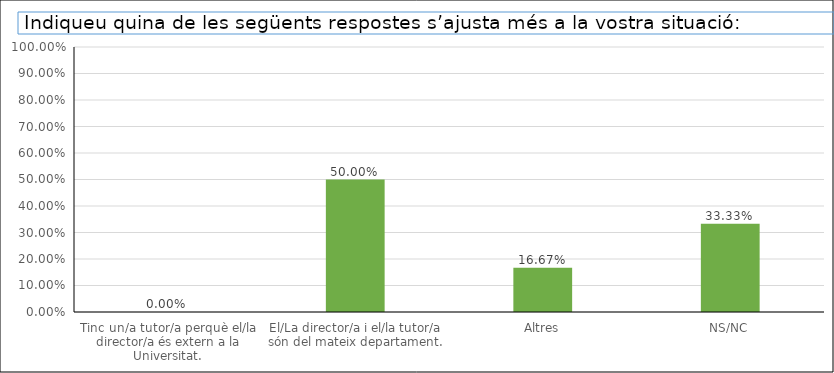
| Category | Series 0 |
|---|---|
| Tinc un/a tutor/a perquè el/la director/a és extern a la Universitat. | 0 |
| El/La director/a i el/la tutor/a són del mateix departament. | 0.5 |
| Altres | 0.167 |
| NS/NC | 0.333 |